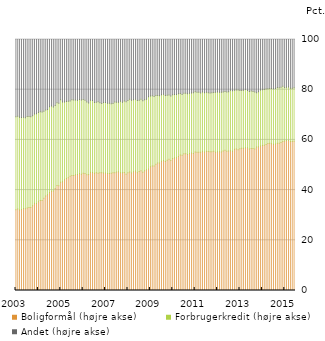
| Category | Boligformål (højre akse) | Forbrugerkredit (højre akse) | Andet (højre akse) |
|---|---|---|---|
| 2003.0 | 32.219 | 36.972 | 30.808 |
| nan | 32.436 | 36.98 | 30.584 |
| nan | 32.075 | 36.913 | 31.012 |
| nan | 32.32 | 36.643 | 31.037 |
| nan | 32.715 | 36.359 | 30.927 |
| nan | 32.586 | 36.284 | 31.13 |
| nan | 32.875 | 36.456 | 30.668 |
| nan | 33.098 | 36.211 | 30.691 |
| nan | 33.067 | 36.189 | 30.744 |
| nan | 33.802 | 35.814 | 30.384 |
| nan | 34.736 | 35.601 | 29.664 |
| nan | 34.655 | 35.81 | 29.534 |
| 2004.0 | 35.382 | 35.57 | 29.048 |
| nan | 35.863 | 35.394 | 28.743 |
| nan | 35.885 | 35.268 | 28.847 |
| nan | 36.722 | 34.677 | 28.601 |
| nan | 37.626 | 34.258 | 28.115 |
| nan | 38.118 | 33.993 | 27.889 |
| nan | 39.089 | 34.138 | 26.773 |
| nan | 39.576 | 33.966 | 26.458 |
| nan | 39.669 | 33.463 | 26.867 |
| nan | 40.607 | 33.066 | 26.327 |
| nan | 41.786 | 32.981 | 25.233 |
| nan | 41.735 | 32.908 | 25.357 |
| 2005.0 | 43.165 | 32.819 | 24.016 |
| nan | 43.313 | 31.753 | 24.934 |
| nan | 44.113 | 30.963 | 24.924 |
| nan | 44.581 | 30.709 | 24.71 |
| nan | 44.964 | 30.478 | 24.558 |
| nan | 45.512 | 29.961 | 24.527 |
| nan | 45.82 | 30.166 | 24.014 |
| nan | 45.805 | 30.075 | 24.12 |
| nan | 46.155 | 29.721 | 24.124 |
| nan | 46.262 | 29.505 | 24.233 |
| nan | 46.649 | 29.409 | 23.943 |
| nan | 46.346 | 29.562 | 24.092 |
| 2006.0 | 46.668 | 29.476 | 23.856 |
| nan | 46.663 | 29.13 | 24.207 |
| nan | 46.099 | 28.959 | 24.942 |
| nan | 46.23 | 28.516 | 25.254 |
| nan | 47.105 | 28.715 | 24.18 |
| nan | 47.058 | 28.602 | 24.34 |
| nan | 46.752 | 28.17 | 25.078 |
| nan | 46.877 | 28.109 | 25.014 |
| nan | 46.663 | 28.505 | 24.832 |
| nan | 46.909 | 27.855 | 25.236 |
| nan | 46.945 | 27.583 | 25.472 |
| nan | 46.815 | 28.084 | 25.101 |
| 2007.0 | 46.776 | 28.109 | 25.115 |
| nan | 46.63 | 27.958 | 25.411 |
| nan | 46.564 | 28.061 | 25.374 |
| nan | 46.696 | 27.688 | 25.616 |
| nan | 46.883 | 27.612 | 25.505 |
| nan | 46.937 | 28.207 | 24.856 |
| nan | 47.225 | 27.801 | 24.973 |
| nan | 47.29 | 27.669 | 25.042 |
| nan | 46.895 | 28.525 | 24.58 |
| nan | 46.934 | 28.105 | 24.961 |
| nan | 47.054 | 28.408 | 24.538 |
| nan | 46.309 | 28.873 | 24.818 |
| 2008.0 | 46.894 | 28.774 | 24.332 |
| nan | 47.196 | 29.044 | 23.76 |
| nan | 46.798 | 29.045 | 24.157 |
| nan | 47.276 | 28.763 | 23.961 |
| nan | 47.581 | 28.618 | 23.801 |
| nan | 46.961 | 28.746 | 24.293 |
| nan | 47.422 | 28.405 | 24.174 |
| nan | 47.751 | 28.419 | 23.83 |
| nan | 47.076 | 28.519 | 24.405 |
| nan | 47.704 | 28.326 | 23.97 |
| nan | 48.067 | 28.085 | 23.848 |
| nan | 48.443 | 28.715 | 22.842 |
| 2009.0 | 49.31 | 28.179 | 22.511 |
| nan | 49.637 | 27.99 | 22.373 |
| nan | 49.601 | 27.686 | 22.713 |
| nan | 50.31 | 27.342 | 22.349 |
| nan | 50.795 | 26.933 | 22.272 |
| nan | 50.775 | 26.781 | 22.444 |
| nan | 51.459 | 26.533 | 22.009 |
| nan | 51.82 | 26.33 | 21.85 |
| nan | 51.38 | 26.345 | 22.275 |
| nan | 51.874 | 25.934 | 22.192 |
| nan | 52.289 | 25.557 | 22.154 |
| nan | 51.808 | 25.715 | 22.477 |
| 2010.0 | 52.591 | 25.399 | 22.01 |
| nan | 52.884 | 25.195 | 21.921 |
| nan | 52.867 | 25.224 | 21.908 |
| nan | 53.356 | 25.052 | 21.592 |
| nan | 53.951 | 24.496 | 21.552 |
| nan | 53.854 | 24.215 | 21.932 |
| nan | 54.437 | 24.134 | 21.429 |
| nan | 54.485 | 24.099 | 21.415 |
| nan | 54.194 | 24.155 | 21.651 |
| nan | 54.63 | 23.914 | 21.456 |
| nan | 54.789 | 23.922 | 21.289 |
| nan | 54.63 | 24.122 | 21.248 |
| 2011.0 | 55.185 | 24.011 | 20.804 |
| nan | 55.127 | 23.868 | 21.005 |
| nan | 55.105 | 23.833 | 21.062 |
| nan | 55.084 | 23.578 | 21.338 |
| nan | 55.509 | 23.527 | 20.964 |
| nan | 55.184 | 23.642 | 21.174 |
| nan | 55.505 | 23.476 | 21.019 |
| nan | 55.356 | 23.448 | 21.196 |
| nan | 55.237 | 23.496 | 21.267 |
| nan | 55.261 | 23.546 | 21.193 |
| nan | 55.434 | 23.491 | 21.075 |
| nan | 55.071 | 23.949 | 20.98 |
| 2012.0 | 55.318 | 23.793 | 20.889 |
| nan | 55.306 | 23.674 | 21.02 |
| nan | 55.215 | 23.773 | 21.012 |
| nan | 55.544 | 23.55 | 20.906 |
| nan | 55.853 | 23.412 | 20.735 |
| nan | 55.51 | 23.616 | 20.874 |
| nan | 55.592 | 23.583 | 20.825 |
| nan | 55.649 | 24.107 | 20.244 |
| nan | 55.451 | 24.111 | 20.438 |
| nan | 56.279 | 23.549 | 20.172 |
| nan | 56.395 | 23.48 | 20.126 |
| nan | 56.096 | 23.738 | 20.166 |
| 2013.0 | 56.497 | 23.178 | 20.325 |
| nan | 56.646 | 23.054 | 20.3 |
| nan | 56.715 | 23.032 | 20.253 |
| nan | 56.895 | 23.184 | 19.921 |
| nan | 56.898 | 22.775 | 20.327 |
| nan | 56.404 | 22.88 | 20.715 |
| nan | 56.561 | 22.95 | 20.489 |
| nan | 56.604 | 22.722 | 20.673 |
| nan | 56.341 | 22.743 | 20.916 |
| nan | 57.147 | 21.59 | 21.263 |
| nan | 57.241 | 21.929 | 20.83 |
| nan | 57.539 | 22.361 | 20.1 |
| 2014.0 | 57.766 | 22.241 | 19.993 |
| nan | 57.909 | 22.169 | 19.921 |
| nan | 58.163 | 22.082 | 19.754 |
| nan | 58.55 | 21.874 | 19.577 |
| nan | 58.656 | 21.846 | 19.497 |
| nan | 58.471 | 22.009 | 19.52 |
| nan | 58.259 | 22.155 | 19.586 |
| nan | 58.375 | 22.09 | 19.535 |
| nan | 58.711 | 22.137 | 19.153 |
| nan | 58.678 | 22.128 | 19.194 |
| nan | 58.932 | 22.024 | 19.043 |
| nan | 59.402 | 22.016 | 18.582 |
| 2015.0 | 59.528 | 21.388 | 19.084 |
| nan | 59.799 | 21.225 | 18.976 |
| nan | 59.723 | 21.325 | 18.951 |
| nan | 59.375 | 21.186 | 19.44 |
| nan | 59.376 | 21.164 | 19.459 |
| nan | 59.482 | 21.297 | 19.22 |